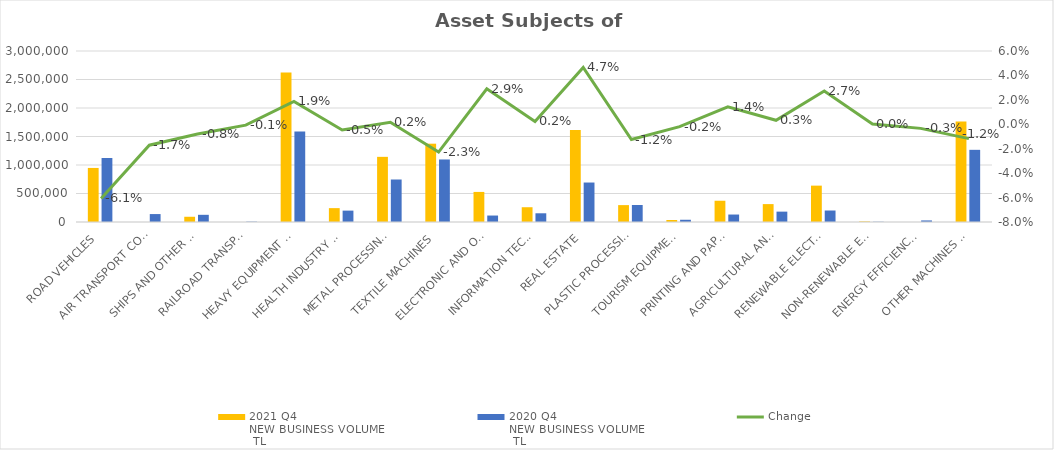
| Category | 2021 Q4 
NEW BUSINESS VOLUME
 TL | 2020 Q4 
NEW BUSINESS VOLUME
 TL |
|---|---|---|
| ROAD VEHICLES | 948376.468 | 1123317.675 |
| AIR TRANSPORT CONVEYANCE | 0 | 139248.447 |
| SHIPS AND OTHER SEA-GOING VESSELS | 91835.524 | 126063.05 |
| RAILROAD TRANSPORT VEHICLES | 0 | 5837.781 |
| HEAVY EQUIPMENT AND CONSTRUCTION MACHINERY | 2623130.981 | 1589194.856 |
| HEALTH INDUSTRY AND AESTHETIC INSTRUMENTS | 243321.652 | 199668.217 |
| METAL PROCESSING MACHINE | 1143085.516 | 745633.761 |
| TEXTILE MACHINES | 1373907.98 | 1097088.6 |
| ELECTRONIC AND OPTICAL DEVICES | 527645.198 | 113398.936 |
| INFORMATION TECHNOLOGIES AND OFFICE SYSTEMS | 259140.056 | 152874.552 |
| REAL ESTATE | 1613184.13 | 692491.049 |
| PLASTIC PROCESSING MACHINES | 296276.19 | 298336.422 |
| TOURISM EQUIPMENT | 35378.869 | 39334.502 |
| PRINTING AND PAPER PROCESSING MACHINES | 372894.248 | 131032.291 |
| AGRICULTURAL AND LIVESTOCK FARMING MACHINES | 314023.297 | 181894.797 |
| RENEWABLE ELECTRICITY GENERATION | 638030.274 | 201519.361 |
| NON-RENEWABLE ELECTRIC ENERGY GENERATION | 9877.067 | 4265.228 |
| ENERGY EFFICIENCY EQUIPMENT | 465.715 | 27556.604 |
| OTHER MACHINES AND EQUIPMENT | 1763245.955 | 1266087.105 |